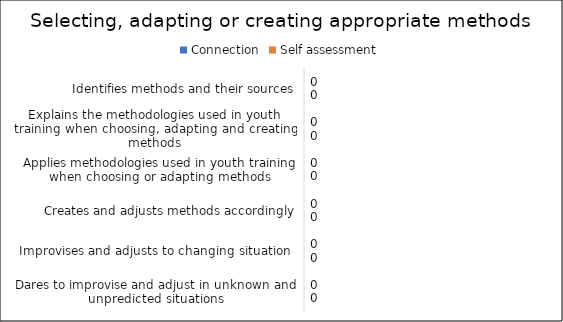
| Category | Connection | Self assessment |
|---|---|---|
| Identifies methods and their sources | 0 | 0 |
| Explains the methodologies used in youth training when choosing, adapting and creating methods | 0 | 0 |
| Applies methodologies used in youth training when choosing or adapting methods | 0 | 0 |
| Creates and adjusts methods accordingly | 0 | 0 |
| Improvises and adjusts to changing situation  | 0 | 0 |
| Dares to improvise and adjust in unknown and unpredicted situations | 0 | 0 |